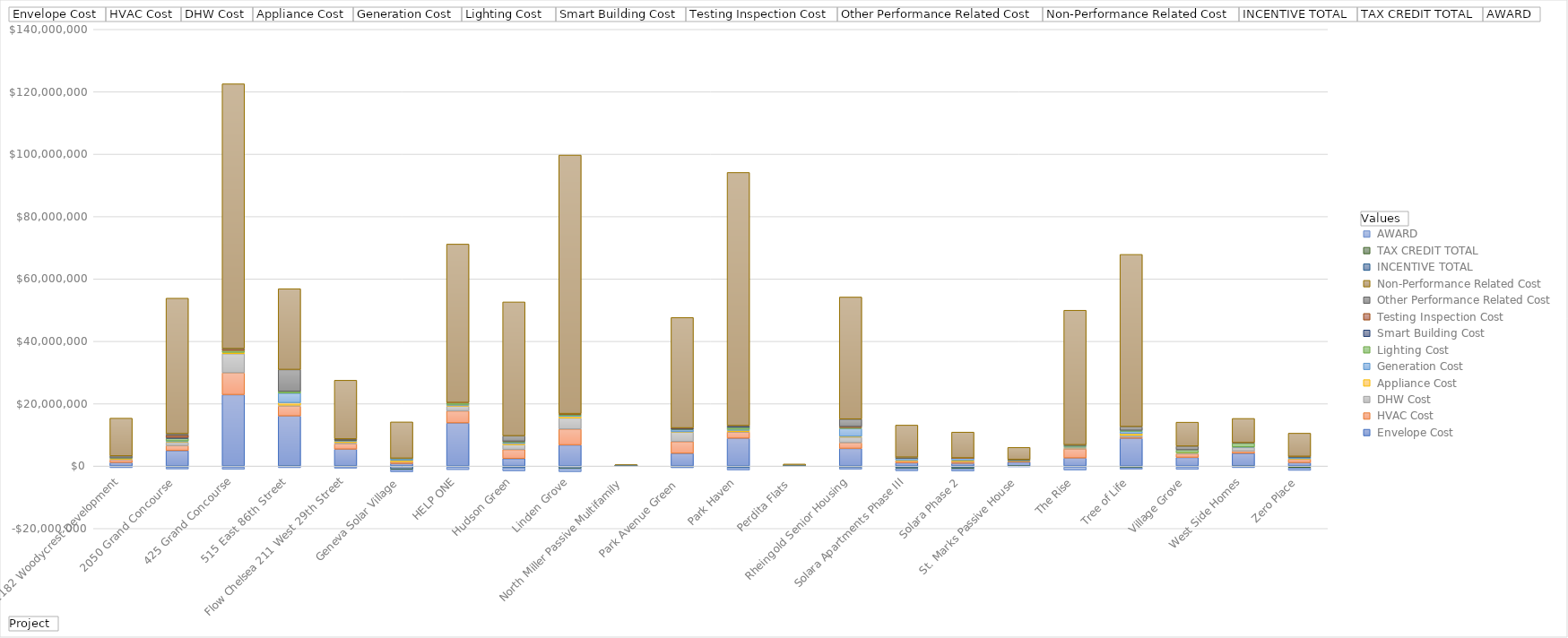
| Category |  Envelope Cost |  HVAC Cost |  DHW Cost |  Appliance Cost |  Generation Cost |  Lighting Cost  |  Smart Building Cost |  Testing Inspection Cost |  Other Performance Related Cost |  Non-Performance Related Cost |  INCENTIVE TOTAL |  TAX CREDIT TOTAL |  AWARD |
|---|---|---|---|---|---|---|---|---|---|---|---|---|---|
| 1182 Woodycrest Development | 1130801.59 | 879051 | 240000 | 140736 | 0 | 200000 | 0 | 0 | 645948 | 12128463.81 | -169700 | 0 | -350931 |
| 2050 Grand Concourse  | 4961040.213 | 1592848.164 | 1059435.67 | 183414 | 254596.04 | 807248.033 | 325541.73 | 689125 | 502235.25 | 43449917.157 | -235624 | -55599 | -647500 |
| 425 Grand Concourse | 22898351.84 | 6998906 | 6106206 | 434701 | 0 | 617156 | 0 | 546700 | 50300 | 84887679.16 | -300000 | 0 | -750000 |
| 515 East 86th Street  | 16052777 | 3168000 | 307000 | 788116 | 3072683 | 553272 | 0 | 0 | 7001039.706 | 25917381.706 | -99617.8 | 0 | -425000 |
| Flow Chelsea 211 West 29th Street | 5414207.77 | 1755748.5 | 356582 | 462963.94 | 157000 | 246715.67 | 50000 | 53050 | 198249.76 | 18820784.21 | -145660 | -49394 | -500000 |
| Geneva Solar Village | 823994 | 520783 | 73950 | 410325 | 571158 | 41511 | 0 | 0 | 64637.931 | 11648847 | -978000 | -140885 | -727236 |
| HELP ONE | 13820490 | 3860000 | 1521600 | 291269 | 263398 | 468693 | 0 | 142906 | 0 | 50797762.19 | -300000 | 0 | -850000 |
| Hudson Green | 2407694.931 | 2900092.81 | 1545000 | 374147 | 411400 | 281632.424 | 0 | 37000 | 1742800 | 42929555.668 | -555000 | 0 | -1000000 |
| Linden Grove | 6779865.441 | 5074592.04 | 3559889.291 | 572717.547 | 232500 | 400000 | 0 | 189900 | 0 | 82895592.98 | -700000 | -100000 | -1000000 |
| North Miller Passive Multifamily | 96977.91 | 8539.65 | 5400 | 7000 | 27815 | 2147.13 | 2300 | 7650 | 5000 | 289777.66 | -12600 | -14255 | -39467 |
| Park Avenue Green  | 4079691.16 | 3770484.94 | 3048214.42 | 63526 | 682830 | 141119.7 | 365000 | 73675 | 0 | 35399236.42 | -270600 | -20400 | -250000 |
| Park Haven | 8918168 | 2028100 | 91500 | 404336 | 339261 | 639515.63 | 403739.06 | 45775 | 100000 | 81164882.15 | -508200 | 0 | -750000 |
| Perdita Flats  | 64925.8 | 30000 | 12400 | 21000 | 34600 | 750 | 0 | 0 | 0 | 500484.2 | -6400 | -14933 | -59976 |
| Rheingold Senior Housing | 5651719.02 | 1830400 | 1791250 | 239216.96 | 2535918.75 | 294500 | 0 | 310000 | 2405000 | 39136690.99 | -339240 | -52250 | -637500 |
| Solara Apartments Phase III | 1057815 | 575523 | 60000 | 233256 | 678000 | 51000 | 45000 | 22372 | 131321 | 10287092 | -558250 | -199800 | -750000 |
| Solara Phase 2 | 884237 | 575523 | 60000 | 299400 | 678000 | 51000 | 45000 | 20826 | 0 | 8280460 | -571050 | -283035 | -750000 |
| St. Marks Passive House | 1286500 | 275000 | 105000 | 120000 | 40000 | 80000 | 0 | 0 | 186730 | 3887850 | -13608 | -29906 | -203082 |
| The Rise | 2579052 | 2922400 | 300000 | 212800 | 273845 | 280000 | 0 | 0 | 260966 | 43128939.45 | -279680 | 0 | -1000000 |
| Tree of Life | 8908493.25 | 366127.83 | 575000 | 625000 | 679194.51 | 300000 | 0 | 0 | 1195947.3 | 55205071.24 | -320000 | -185526 | -500000 |
| Village Grove | 2770500 | 1174200 | 320280 | 30642.95 | 0 | 888684 | 0 | 0 | 1189475 | 7697481.89 | -274000 | 0 | -792438 |
| West Side Homes | 4104825.56 | 695077 | 1134500 | 99865 | 119136.74 | 1135010 | 0 | 0 | 224844.694 | 7763945.9 | -115819 | -27878 | -362620 |
| Zero Place | 1101500 | 1100000 | 50000 | 110630 | 475000 | 10000 | 215000 | 45000 | 0 | 7440183 | -315040 | -313400 | -750000 |